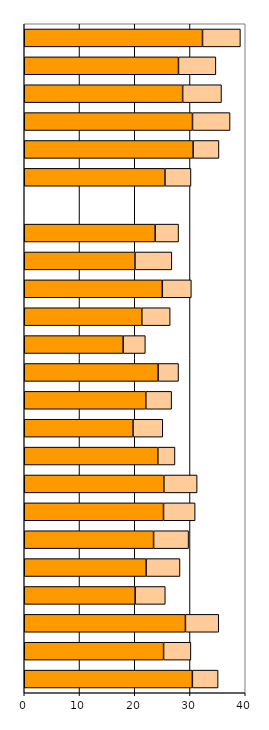
| Category | Series 0 | Series 1 |
|---|---|---|
| 0 | 30.43 | 4.657 |
| 1 | 25.219 | 4.945 |
| 2 | 29.174 | 6.028 |
| 3 | 20.073 | 5.453 |
| 4 | 22.054 | 6.131 |
| 5 | 23.408 | 6.336 |
| 6 | 25.205 | 5.723 |
| 7 | 25.269 | 6.021 |
| 8 | 24.177 | 3.1 |
| 9 | 19.688 | 5.382 |
| 10 | 21.998 | 4.677 |
| 11 | 24.233 | 3.691 |
| 12 | 17.897 | 4.02 |
| 13 | 21.278 | 5.13 |
| 14 | 24.989 | 5.252 |
| 15 | 20.034 | 6.678 |
| 16 | 23.686 | 4.244 |
| 17 | 0 | 0 |
| 18 | 25.461 | 4.715 |
| 19 | 30.562 | 4.678 |
| 20 | 30.453 | 6.798 |
| 21 | 28.669 | 7.03 |
| 22 | 27.913 | 6.77 |
| 23 | 32.268 | 6.853 |